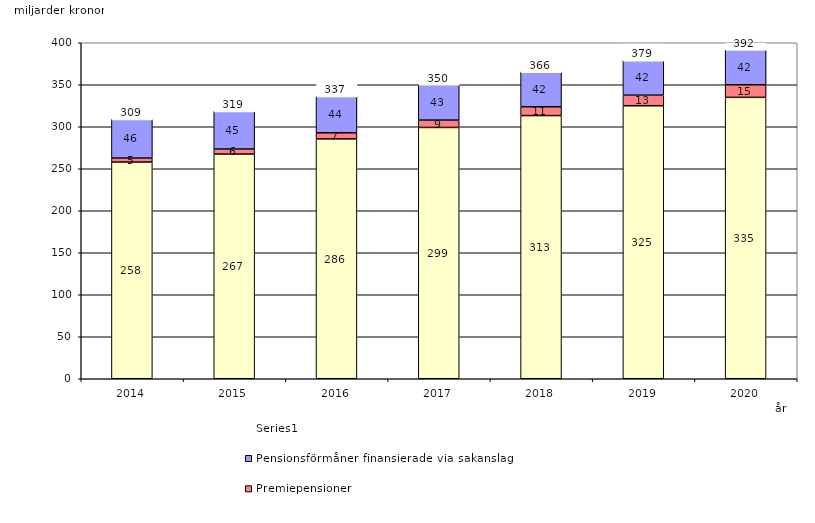
| Category | Inkomstpension och tilläggspension m.m. | Premiepensioner | Pensionsförmåner finansierade via sakanslag | Series 0 |
|---|---|---|---|---|
| 2014.0 | 257.988 | 4.739 | 46.4 | 20 |
| 2015.0 | 267.469 | 6.013 | 45.4 | 20 |
| 2016.0 | 285.511 | 7.304 | 43.738 | 20 |
| 2017.0 | 299.181 | 8.78 | 42.508 | 20 |
| 2018.0 | 313.316 | 10.529 | 41.759 | 20 |
| 2019.0 | 325.022 | 12.584 | 41.628 | 20 |
| 2020.0 | 334.991 | 14.996 | 41.943 | 20 |